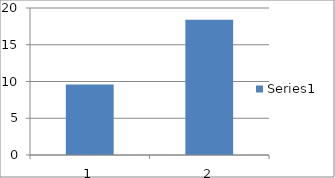
| Category | Series 0 |
|---|---|
| 0 | 9.6 |
| 1 | 18.4 |